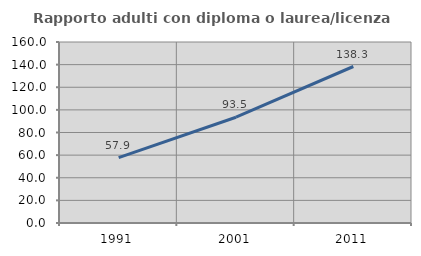
| Category | Rapporto adulti con diploma o laurea/licenza media  |
|---|---|
| 1991.0 | 57.858 |
| 2001.0 | 93.482 |
| 2011.0 | 138.341 |